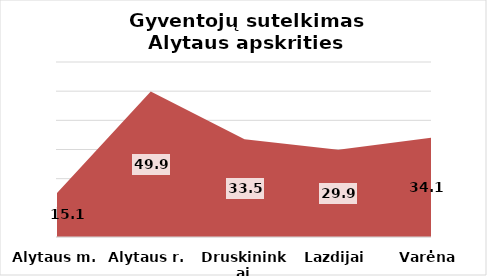
| Category | Series 0 |
|---|---|
| Alytaus m. | 15.1 |
| Alytaus r. | 49.9 |
| Druskininkai | 33.5 |
| Lazdijai | 29.9 |
| Varėna | 34.1 |